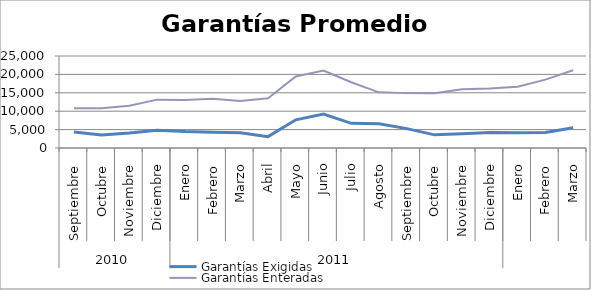
| Category | Garantías Exigidas | Garantías Enteradas |
|---|---|---|
| 0 | 4372.607 | 10829.062 |
| 1 | 3557.93 | 10787.9 |
| 2 | 4056.528 | 11463.422 |
| 3 | 4832.111 | 13142.881 |
| 4 | 4466.32 | 13061.162 |
| 5 | 4313.718 | 13357.444 |
| 6 | 4162.491 | 12796.251 |
| 7 | 3090.395 | 13495.263 |
| 8 | 7655.186 | 19416.342 |
| 9 | 9198.096 | 21035.301 |
| 10 | 6699.851 | 17866.843 |
| 11 | 6615.292 | 15119.839 |
| 12 | 5266.973 | 14911.639 |
| 13 | 3572.137 | 14861.465 |
| 14 | 3876.388 | 15976.819 |
| 15 | 4182.413 | 16147.351 |
| 16 | 4146.8 | 16662.483 |
| 17 | 4190.531 | 18572.749 |
| 18 | 5482.211 | 21128.648 |